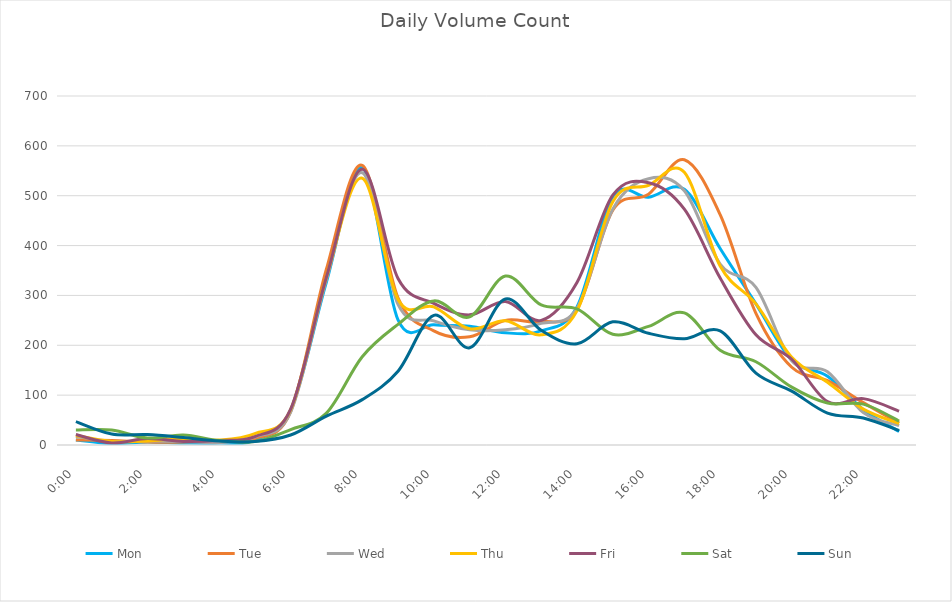
| Category | Mon | Tue | Wed | Thu | Fri | Sat | Sun |
|---|---|---|---|---|---|---|---|
| 0.0 | 10 | 10 | 17 | 19 | 21 | 30 | 47 |
| 0.0416666666666667 | 3 | 9 | 7 | 7 | 4 | 30 | 22 |
| 0.0833333333333333 | 6 | 6 | 8 | 8 | 13 | 14 | 21 |
| 0.125 | 4 | 6 | 7 | 13 | 7 | 20 | 15 |
| 0.166666666666667 | 4 | 9 | 5 | 10 | 9 | 9 | 8 |
| 0.208333333333333 | 10 | 13 | 16 | 23 | 17 | 7 | 7 |
| 0.25 | 70 | 67 | 66 | 71 | 72 | 31 | 20 |
| 0.291666666666667 | 327 | 353 | 332 | 337 | 337 | 64 | 58 |
| 0.333333333333333 | 556 | 561 | 546 | 535 | 553 | 177 | 91 |
| 0.375 | 251 | 295 | 282 | 292 | 334 | 242 | 148 |
| 0.416666666666667 | 241 | 229 | 249 | 277 | 284 | 289 | 260 |
| 0.4583333333333333 | 238 | 217 | 231 | 233 | 261 | 257 | 195 |
| 0.5 | 225 | 250 | 231 | 249 | 288 | 339 | 293 |
| 0.541666666666667 | 229 | 247 | 244 | 221 | 250 | 281 | 230 |
| 0.5833333333333334 | 277 | 272 | 274 | 269 | 326 | 273 | 203 |
| 0.625 | 498 | 471 | 473 | 488 | 501 | 222 | 247 |
| 0.666666666666667 | 497 | 503 | 534 | 521 | 526 | 238 | 224 |
| 0.7083333333333334 | 513 | 572 | 510 | 547 | 473 | 265 | 213 |
| 0.75 | 394 | 462 | 363 | 359 | 335 | 190 | 229 |
| 0.791666666666667 | 283 | 264 | 316 | 283 | 221 | 167 | 144 |
| 0.8333333333333334 | 170 | 156 | 169 | 176 | 172 | 116 | 108 |
| 0.875 | 138 | 129 | 147 | 126 | 87 | 84 | 64 |
| 0.916666666666667 | 71 | 85 | 65 | 72 | 93 | 82 | 54 |
| 0.9583333333333334 | 27 | 44 | 39 | 43 | 68 | 48 | 29 |